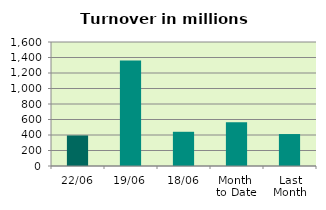
| Category | Series 0 |
|---|---|
| 22/06 | 393.927 |
| 19/06 | 1359.954 |
| 18/06 | 441.563 |
| Month 
to Date | 563.632 |
| Last
Month | 412.236 |